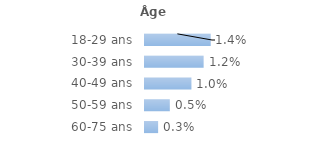
| Category | Series 0 |
|---|---|
| 18-29 ans | 0.014 |
| 30-39 ans | 0.012 |
| 40-49 ans | 0.01 |
| 50-59 ans | 0.005 |
| 60-75 ans | 0.003 |